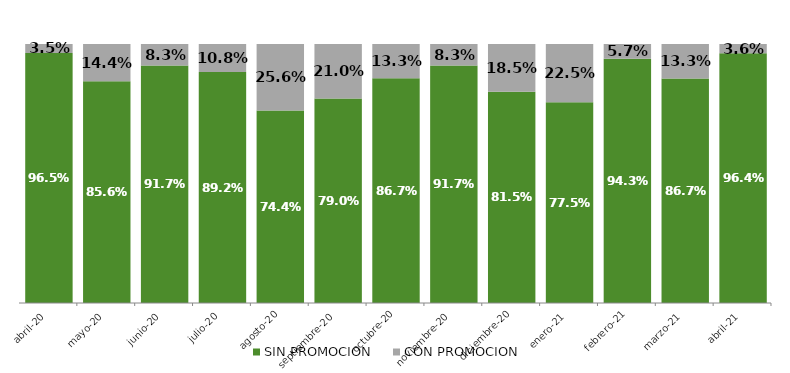
| Category | SIN PROMOCION   | CON PROMOCION   |
|---|---|---|
| 2020-04-01 | 0.965 | 0.035 |
| 2020-05-01 | 0.856 | 0.144 |
| 2020-06-01 | 0.917 | 0.083 |
| 2020-07-01 | 0.892 | 0.108 |
| 2020-08-01 | 0.744 | 0.256 |
| 2020-09-01 | 0.79 | 0.21 |
| 2020-10-01 | 0.867 | 0.133 |
| 2020-11-01 | 0.917 | 0.083 |
| 2020-12-01 | 0.815 | 0.185 |
| 2021-01-01 | 0.775 | 0.225 |
| 2021-02-01 | 0.943 | 0.057 |
| 2021-03-01 | 0.867 | 0.133 |
| 2021-04-01 | 0.964 | 0.036 |